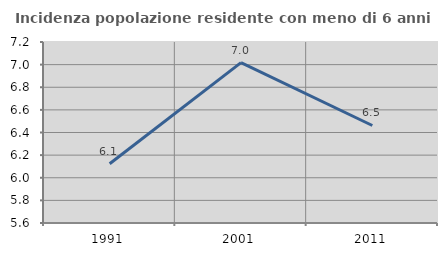
| Category | Incidenza popolazione residente con meno di 6 anni |
|---|---|
| 1991.0 | 6.123 |
| 2001.0 | 7.018 |
| 2011.0 | 6.462 |